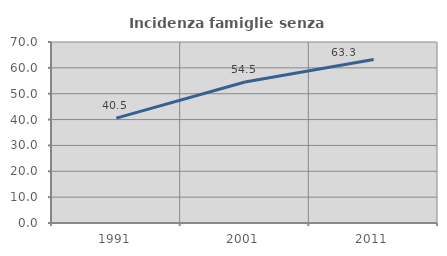
| Category | Incidenza famiglie senza nuclei |
|---|---|
| 1991.0 | 40.541 |
| 2001.0 | 54.545 |
| 2011.0 | 63.265 |